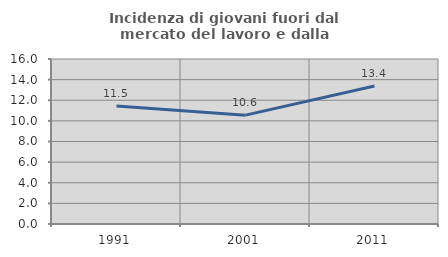
| Category | Incidenza di giovani fuori dal mercato del lavoro e dalla formazione  |
|---|---|
| 1991.0 | 11.45 |
| 2001.0 | 10.556 |
| 2011.0 | 13.38 |